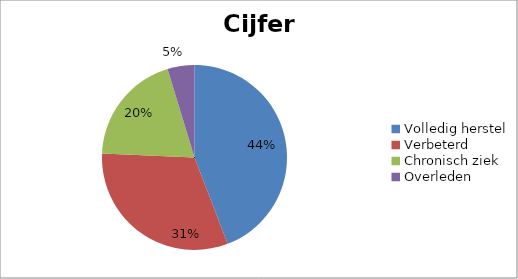
| Category | Cijfers |
|---|---|
| Volledig herstel | 0.469 |
| Verbeterd | 0.335 |
| Chronisch ziek | 0.208 |
| Overleden | 0.05 |